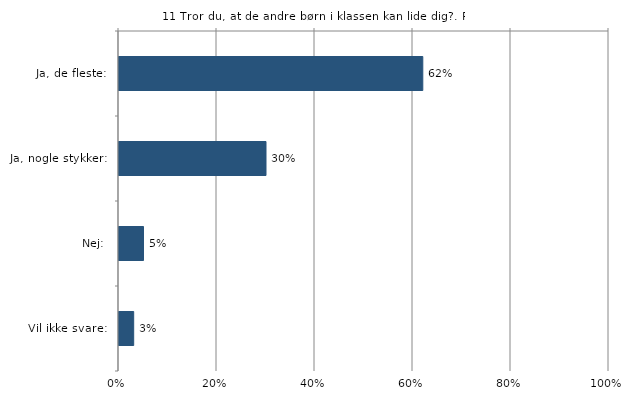
| Category | Tror du, at de andre børn i klassen kan lide dig? |
|---|---|
| Ja, de fleste:  | 0.62 |
| Ja, nogle stykker:  | 0.3 |
| Nej:  | 0.05 |
| Vil ikke svare:  | 0.03 |